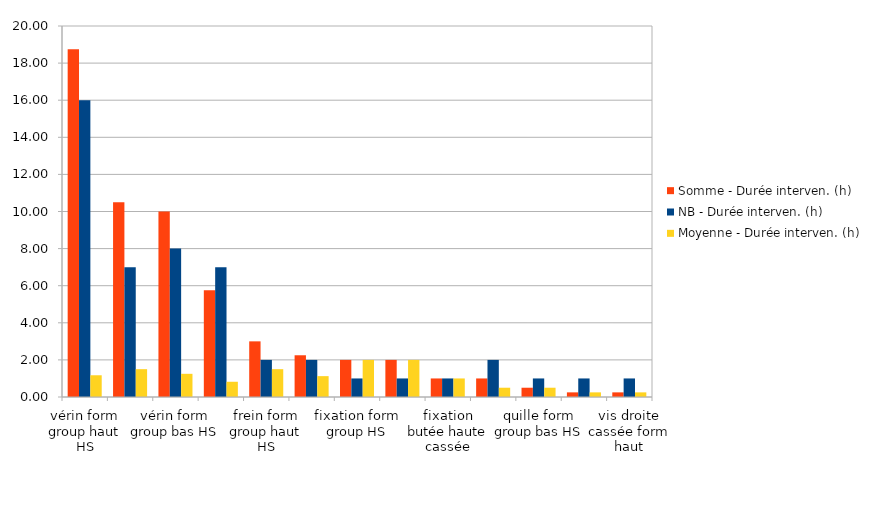
| Category | Somme - Durée interven. (h) | NB - Durée interven. (h) | Moyenne - Durée interven. (h) |
|---|---|---|---|
| vérin form group haut HS | 18.75 | 16 | 1.172 |
| tête vérin form group haut HS | 10.5 | 7 | 1.5 |
| vérin form group bas HS | 10 | 8 | 1.25 |
| aspiration HS | 5.75 | 7 | 0.821 |
| frein form group haut HS | 3 | 2 | 1.5 |
| freins form group HS | 2.25 | 2 | 1.125 |
| fixation form group HS | 2 | 1 | 2 |
| gougons réglage hauteur table haute HS | 2 | 1 | 2 |
| fixation butée haute cassée | 1 | 1 | 1 |
| press form HS | 1 | 2 | 0.5 |
| quille form group bas HS | 0.5 | 1 | 0.5 |
| vis cassée colonne avant | 0.25 | 1 | 0.25 |
| vis droite cassée form haut | 0.25 | 1 | 0.25 |